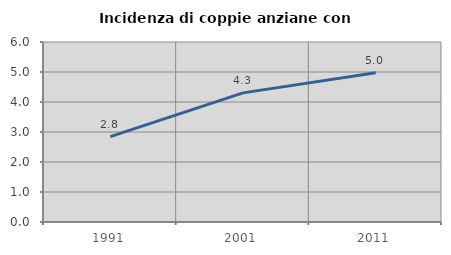
| Category | Incidenza di coppie anziane con figli |
|---|---|
| 1991.0 | 2.846 |
| 2001.0 | 4.305 |
| 2011.0 | 4.978 |